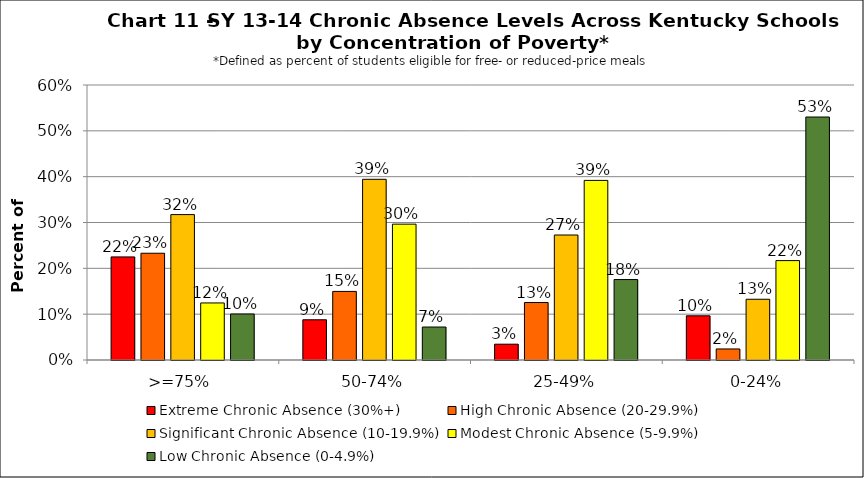
| Category | Extreme Chronic Absence (30%+) | High Chronic Absence (20-29.9%) | Significant Chronic Absence (10-19.9%) | Modest Chronic Absence (5-9.9%) | Low Chronic Absence (0-4.9%) |
|---|---|---|---|---|---|
| 0 | 0.225 | 0.233 | 0.317 | 0.124 | 0.1 |
| 1 | 0.088 | 0.15 | 0.394 | 0.296 | 0.072 |
| 2 | 0.034 | 0.125 | 0.273 | 0.392 | 0.176 |
| 3 | 0.096 | 0.024 | 0.133 | 0.217 | 0.53 |